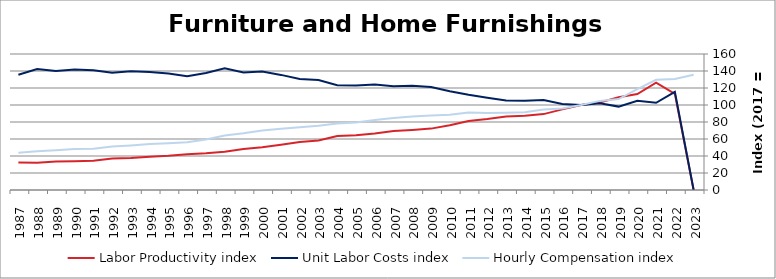
| Category | Labor Productivity index | Unit Labor Costs index | Hourly Compensation index |
|---|---|---|---|
| 2023.0 | 0 | 0 | 135.514 |
| 2022.0 | 113.113 | 115.512 | 130.66 |
| 2021.0 | 126.364 | 102.621 | 129.676 |
| 2020.0 | 112.919 | 105.05 | 118.621 |
| 2019.0 | 109.07 | 98.106 | 107.004 |
| 2018.0 | 102.859 | 101.913 | 104.827 |
| 2017.0 | 100 | 100 | 100 |
| 2016.0 | 94.824 | 101.071 | 95.84 |
| 2015.0 | 89.284 | 105.916 | 94.566 |
| 2014.0 | 87.298 | 104.89 | 91.567 |
| 2013.0 | 86.484 | 105.194 | 90.976 |
| 2012.0 | 83.498 | 108.649 | 90.72 |
| 2011.0 | 81.229 | 112.184 | 91.126 |
| 2010.0 | 76.088 | 116.289 | 88.482 |
| 2009.0 | 72.212 | 121.247 | 87.555 |
| 2008.0 | 70.559 | 122.604 | 86.508 |
| 2007.0 | 69.335 | 122.019 | 84.602 |
| 2006.0 | 66.348 | 124.152 | 82.372 |
| 2005.0 | 64.482 | 122.963 | 79.289 |
| 2004.0 | 63.445 | 123.209 | 78.17 |
| 2003.0 | 58.365 | 129.465 | 75.562 |
| 2002.0 | 56.52 | 130.659 | 73.848 |
| 2001.0 | 53.122 | 135.418 | 71.937 |
| 2000.0 | 50.167 | 139.333 | 69.898 |
| 1999.0 | 48.205 | 138.34 | 66.687 |
| 1998.0 | 44.872 | 143.147 | 64.233 |
| 1997.0 | 43.111 | 137.667 | 59.35 |
| 1996.0 | 41.928 | 133.786 | 56.094 |
| 1995.0 | 40.173 | 136.955 | 55.019 |
| 1994.0 | 38.973 | 138.828 | 54.106 |
| 1993.0 | 37.507 | 139.702 | 52.398 |
| 1992.0 | 37.113 | 137.843 | 51.157 |
| 1991.0 | 34.514 | 140.876 | 48.621 |
| 1990.0 | 33.921 | 141.825 | 48.109 |
| 1989.0 | 33.448 | 139.935 | 46.805 |
| 1988.0 | 32.05 | 142.328 | 45.616 |
| 1987.0 | 32.261 | 135.517 | 43.719 |